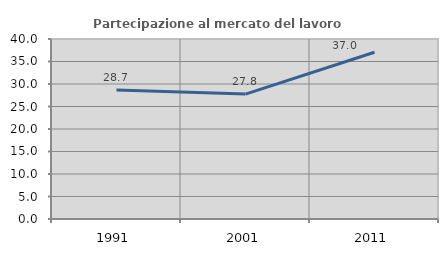
| Category | Partecipazione al mercato del lavoro  femminile |
|---|---|
| 1991.0 | 28.693 |
| 2001.0 | 27.757 |
| 2011.0 | 37.044 |